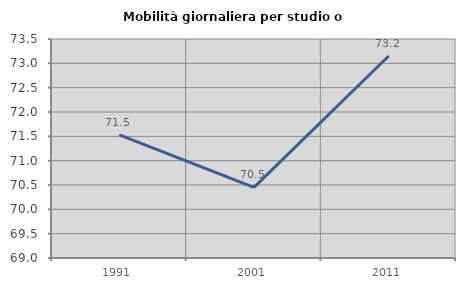
| Category | Mobilità giornaliera per studio o lavoro |
|---|---|
| 1991.0 | 71.53 |
| 2001.0 | 70.451 |
| 2011.0 | 73.151 |